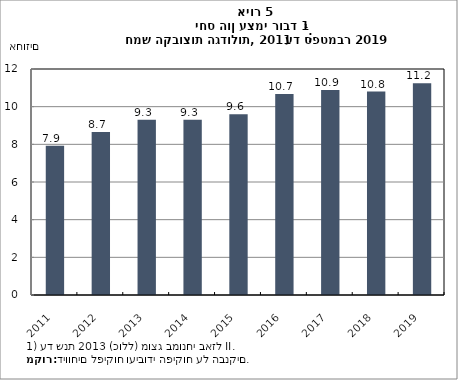
| Category | יחס הון עצמי רובד 1 |
|---|---|
| 2011-12-31 | 7.93 |
| 2012-12-31 | 8.65 |
| 2013-12-31 | 9.3 |
| 2014-12-31 | 9.3 |
| 2015-12-31 | 9.6 |
| 2016-12-31 | 10.67 |
| 2017-12-31 | 10.89 |
| 2018-12-31 | 10.8 |
| 2019-09-01 | 11.242 |